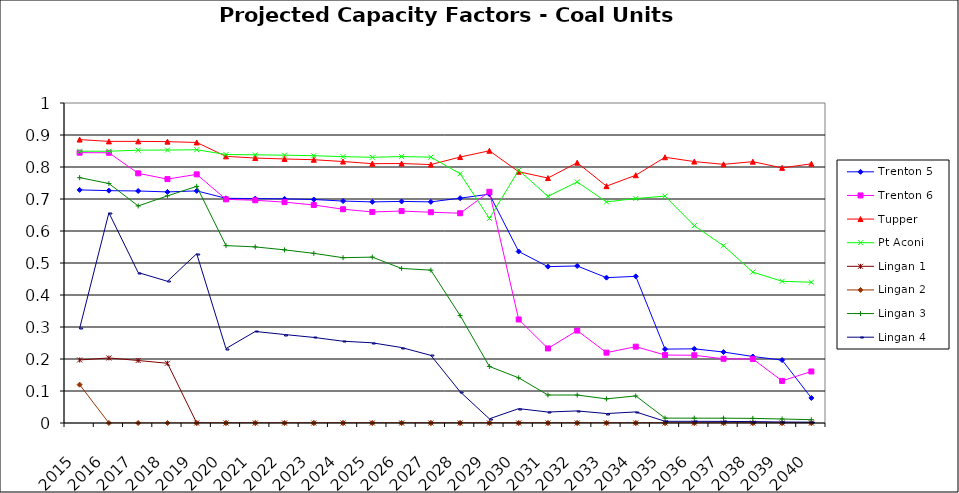
| Category | Trenton 5 | Trenton 6 | Tupper | Pt Aconi | Lingan 1 | Lingan 2 | Lingan 3 | Lingan 4 |
|---|---|---|---|---|---|---|---|---|
| 2015.0 | 0.728 | 0.845 | 0.886 | 0.849 | 0.197 | 0.12 | 0.767 | 0.296 |
| 2016.0 | 0.726 | 0.844 | 0.88 | 0.849 | 0.203 | 0 | 0.748 | 0.657 |
| 2017.0 | 0.725 | 0.78 | 0.88 | 0.852 | 0.195 | 0 | 0.678 | 0.47 |
| 2018.0 | 0.722 | 0.762 | 0.879 | 0.853 | 0.187 | 0 | 0.71 | 0.443 |
| 2019.0 | 0.725 | 0.777 | 0.877 | 0.854 | 0 | 0 | 0.739 | 0.529 |
| 2020.0 | 0.702 | 0.699 | 0.833 | 0.839 | 0 | 0 | 0.554 | 0.233 |
| 2021.0 | 0.701 | 0.696 | 0.828 | 0.838 | 0 | 0 | 0.55 | 0.286 |
| 2022.0 | 0.7 | 0.69 | 0.825 | 0.837 | 0 | 0 | 0.541 | 0.277 |
| 2023.0 | 0.698 | 0.681 | 0.823 | 0.835 | 0 | 0 | 0.53 | 0.267 |
| 2024.0 | 0.694 | 0.668 | 0.817 | 0.832 | 0 | 0 | 0.517 | 0.256 |
| 2025.0 | 0.691 | 0.66 | 0.81 | 0.83 | 0 | 0 | 0.518 | 0.251 |
| 2026.0 | 0.692 | 0.662 | 0.811 | 0.833 | 0 | 0 | 0.483 | 0.236 |
| 2027.0 | 0.691 | 0.659 | 0.808 | 0.831 | 0 | 0 | 0.478 | 0.211 |
| 2028.0 | 0.703 | 0.656 | 0.831 | 0.779 | 0 | 0 | 0.336 | 0.098 |
| 2029.0 | 0.715 | 0.723 | 0.851 | 0.639 | 0 | 0 | 0.177 | 0.013 |
| 2030.0 | 0.536 | 0.323 | 0.785 | 0.79 | 0 | 0 | 0.141 | 0.045 |
| 2031.0 | 0.489 | 0.233 | 0.765 | 0.708 | 0 | 0 | 0.087 | 0.034 |
| 2032.0 | 0.491 | 0.289 | 0.813 | 0.753 | 0 | 0 | 0.087 | 0.038 |
| 2033.0 | 0.454 | 0.22 | 0.74 | 0.691 | 0 | 0 | 0.075 | 0.03 |
| 2034.0 | 0.458 | 0.239 | 0.774 | 0.702 | 0 | 0 | 0.085 | 0.035 |
| 2035.0 | 0.231 | 0.212 | 0.83 | 0.709 | 0 | 0 | 0.015 | 0.005 |
| 2036.0 | 0.232 | 0.212 | 0.817 | 0.617 | 0 | 0 | 0.015 | 0.005 |
| 2037.0 | 0.222 | 0.201 | 0.808 | 0.554 | 0 | 0 | 0.015 | 0.005 |
| 2038.0 | 0.208 | 0.2 | 0.817 | 0.472 | 0 | 0 | 0.014 | 0.004 |
| 2039.0 | 0.197 | 0.132 | 0.797 | 0.443 | 0 | 0 | 0.012 | 0.003 |
| 2040.0 | 0.078 | 0.161 | 0.81 | 0.44 | 0 | 0 | 0.01 | 0.003 |